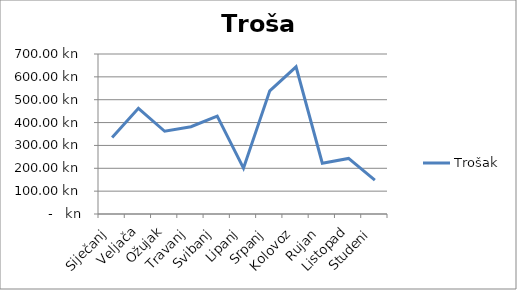
| Category | Trošak |
|---|---|
| Siječanj | 334.4 |
| Veljača | 462.65 |
| Ožujak | 361.95 |
| Travanj | 381.9 |
| Svibanj | 428.45 |
| Lipanj | 200.45 |
| Srpanj | 538.65 |
| Kolovoz | 644.1 |
| Rujan | 222.3 |
| Listopad | 243.2 |
| Studeni | 148.2 |